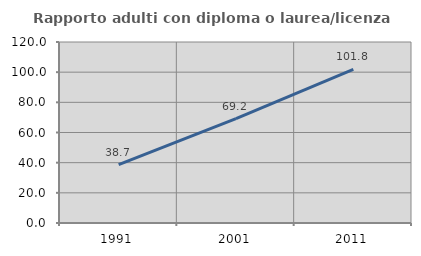
| Category | Rapporto adulti con diploma o laurea/licenza media  |
|---|---|
| 1991.0 | 38.652 |
| 2001.0 | 69.191 |
| 2011.0 | 101.808 |